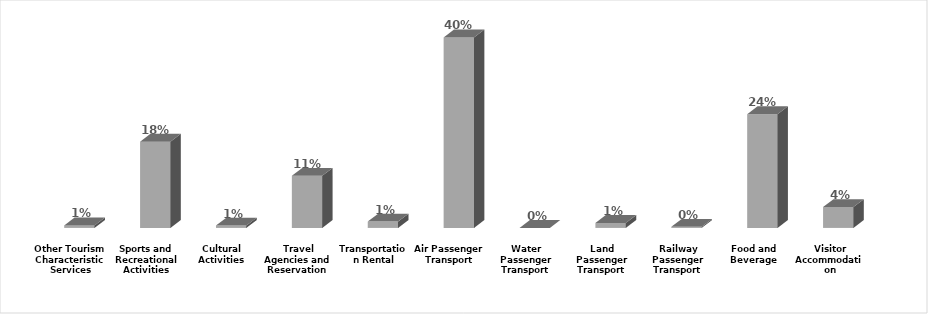
| Category | Series 0 |
|---|---|
| Visitor Accommodation | 0.044 |
| Food and Beverage | 0.237 |
| Railway Passenger Transport | 0.002 |
| Land Passenger Transport | 0.01 |
| Water Passenger Transport | 0 |
| Air Passenger Transport | 0.396 |
| Transportation Rental | 0.013 |
| Travel Agencies and Reservation Services | 0.108 |
| Cultural Activities | 0.005 |
| Sports and Recreational Activities | 0.179 |
| Other Tourism Characteristic Services | 0.005 |